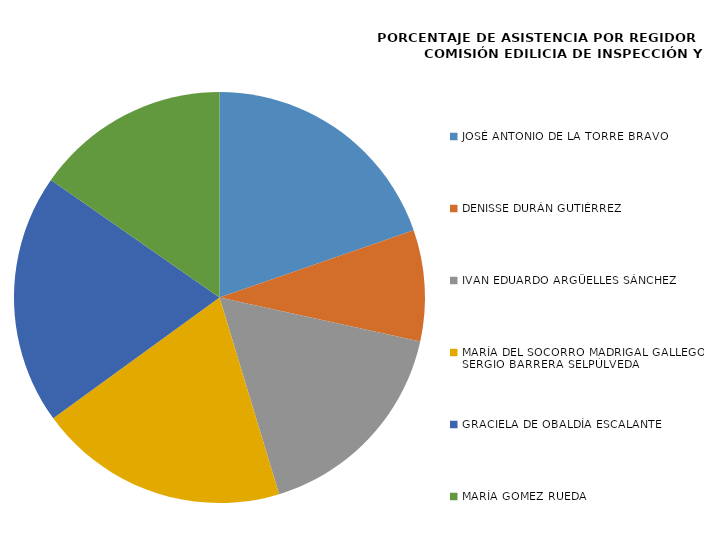
| Category | Series 0 |
|---|---|
| JOSÉ ANTONIO DE LA TORRE BRAVO | 100 |
| DENISSE DURÁN GUTIÉRREZ | 44.444 |
| IVAN EDUARDO ARGÜELLES SÁNCHEZ | 85.714 |
| MARÍA DEL SOCORRO MADRIGAL GALLEGOS/
SERGIO BARRERA SELPÚLVEDA | 100 |
| GRACIELA DE OBALDÍA ESCALANTE | 100 |
| MARÍA GOMEZ RUEDA | 77.778 |